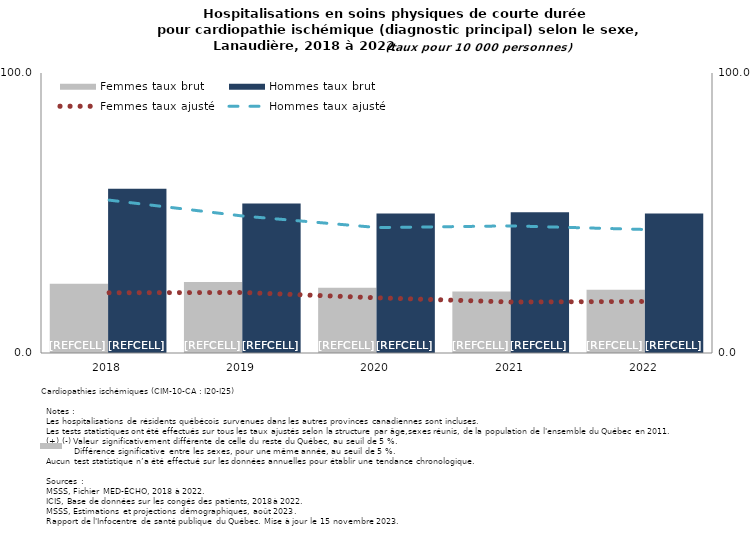
| Category | Femmes taux brut | Hommes taux brut |
|---|---|---|
| 2018.0 | 24.7 | 58.7 |
| 2019.0 | 25.4 | 53.4 |
| 2020.0 | 23.3 | 49.8 |
| 2021.0 | 22 | 50.3 |
| 2022.0 | 22.6 | 49.8 |